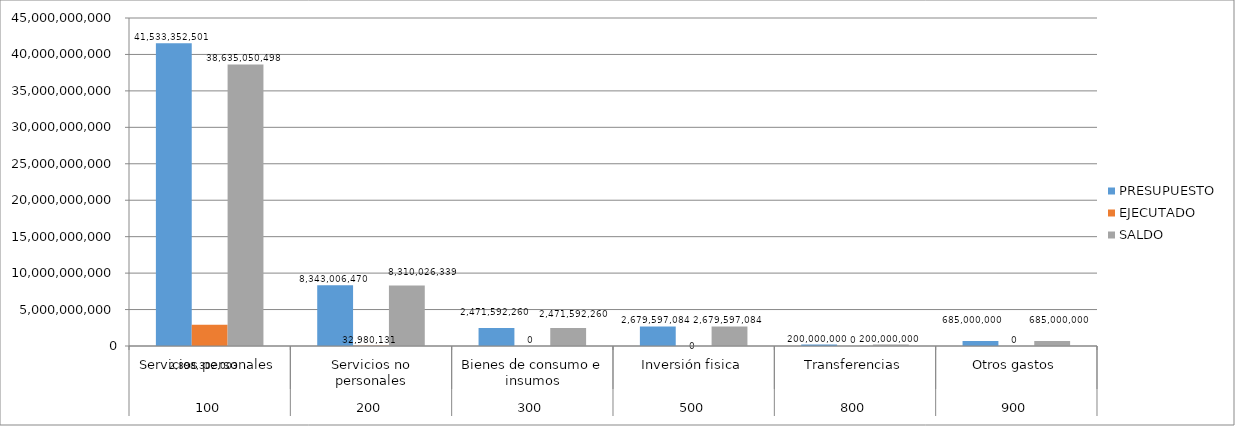
| Category | PRESUPUESTO | EJECUTADO | SALDO |
|---|---|---|---|
| 0 | 41533352501 | 2898302003 | 38635050498 |
| 1 | 8343006470 | 32980131 | 8310026339 |
| 2 | 2471592260 | 0 | 2471592260 |
| 3 | 2679597084 | 0 | 2679597084 |
| 4 | 200000000 | 0 | 200000000 |
| 5 | 685000000 | 0 | 685000000 |